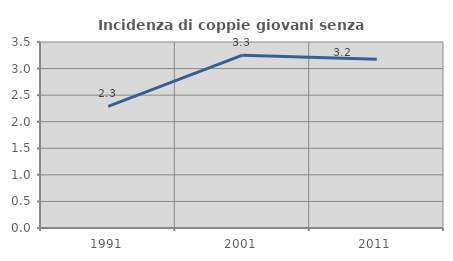
| Category | Incidenza di coppie giovani senza figli |
|---|---|
| 1991.0 | 2.29 |
| 2001.0 | 3.252 |
| 2011.0 | 3.175 |